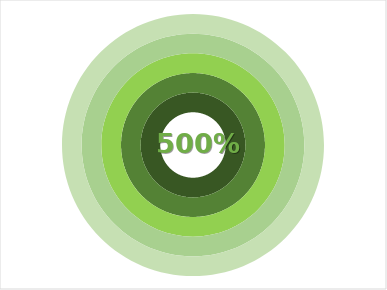
| Category | Series 0 | Series 1 | Series 2 | Series 3 | Series 4 |
|---|---|---|---|---|---|
| 0 | 1 | 1 | 1 | 1 | 1 |
| 1 | 0 | 0 | 0 | 0 | 0 |